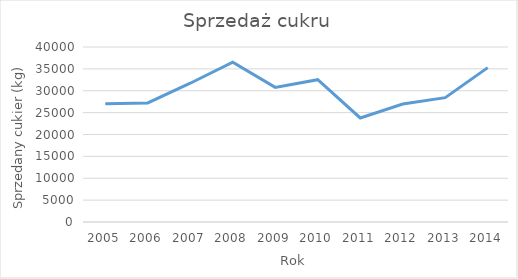
| Category | Suma sprzedaży |
|---|---|
| 2005.0 | 27016 |
| 2006.0 | 27226 |
| 2007.0 | 31720 |
| 2008.0 | 36523 |
| 2009.0 | 30764 |
| 2010.0 | 32521 |
| 2011.0 | 23778 |
| 2012.0 | 26976 |
| 2013.0 | 28419 |
| 2014.0 | 35284 |